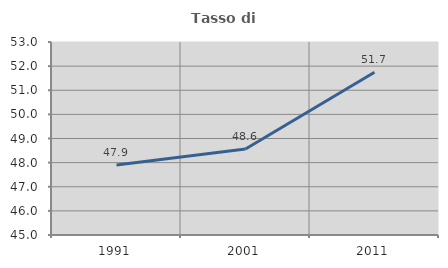
| Category | Tasso di occupazione   |
|---|---|
| 1991.0 | 47.899 |
| 2001.0 | 48.567 |
| 2011.0 | 51.746 |